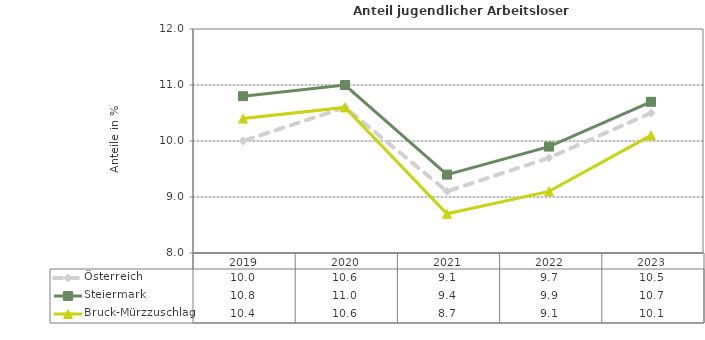
| Category | Österreich | Steiermark | Bruck-Mürzzuschlag |
|---|---|---|---|
| 2023.0 | 10.5 | 10.7 | 10.1 |
| 2022.0 | 9.7 | 9.9 | 9.1 |
| 2021.0 | 9.1 | 9.4 | 8.7 |
| 2020.0 | 10.6 | 11 | 10.6 |
| 2019.0 | 10 | 10.8 | 10.4 |